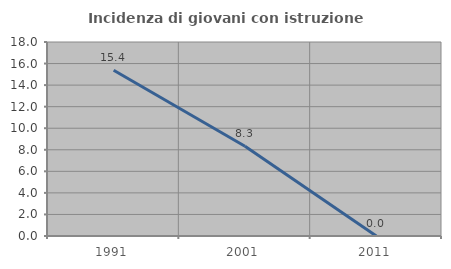
| Category | Incidenza di giovani con istruzione universitaria |
|---|---|
| 1991.0 | 15.385 |
| 2001.0 | 8.333 |
| 2011.0 | 0 |